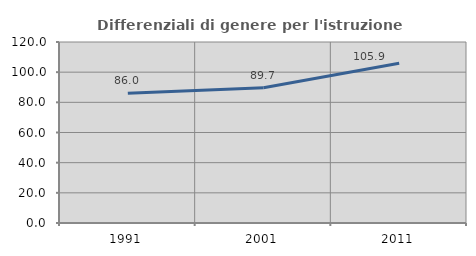
| Category | Differenziali di genere per l'istruzione superiore |
|---|---|
| 1991.0 | 85.995 |
| 2001.0 | 89.735 |
| 2011.0 | 105.87 |